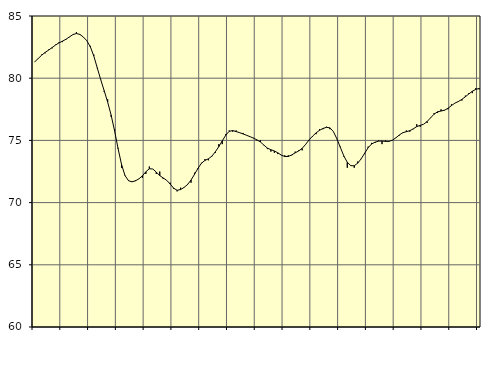
| Category | Piggar | Series 1 |
|---|---|---|
| nan | 81.3 | 81.32 |
| 87.0 | 81.6 | 81.58 |
| 87.0 | 81.9 | 81.85 |
| 87.0 | 82 | 82.07 |
| nan | 82.3 | 82.26 |
| 88.0 | 82.4 | 82.46 |
| 88.0 | 82.7 | 82.67 |
| 88.0 | 82.9 | 82.84 |
| nan | 82.9 | 82.98 |
| 89.0 | 83.1 | 83.13 |
| 89.0 | 83.3 | 83.32 |
| 89.0 | 83.5 | 83.51 |
| nan | 83.7 | 83.59 |
| 90.0 | 83.5 | 83.52 |
| 90.0 | 83.3 | 83.31 |
| 90.0 | 83 | 83.01 |
| nan | 82.6 | 82.53 |
| 91.0 | 81.9 | 81.79 |
| 91.0 | 80.8 | 80.84 |
| 91.0 | 79.9 | 79.88 |
| nan | 78.9 | 78.99 |
| 92.0 | 78.3 | 78.08 |
| 92.0 | 76.9 | 77.03 |
| 92.0 | 75.9 | 75.76 |
| nan | 74.4 | 74.34 |
| 93.0 | 72.8 | 73.06 |
| 93.0 | 72.2 | 72.17 |
| 93.0 | 71.8 | 71.76 |
| nan | 71.7 | 71.67 |
| 94.0 | 71.8 | 71.75 |
| 94.0 | 71.9 | 71.91 |
| 94.0 | 72 | 72.15 |
| nan | 72.3 | 72.48 |
| 95.0 | 72.9 | 72.72 |
| 95.0 | 72.7 | 72.7 |
| 95.0 | 72.3 | 72.45 |
| nan | 72.5 | 72.17 |
| 96.0 | 71.9 | 71.98 |
| 96.0 | 71.8 | 71.79 |
| 96.0 | 71.6 | 71.49 |
| nan | 71.1 | 71.16 |
| 97.0 | 70.9 | 70.99 |
| 97.0 | 71.2 | 71.05 |
| 97.0 | 71.2 | 71.22 |
| nan | 71.5 | 71.45 |
| 98.0 | 71.6 | 71.81 |
| 98.0 | 72.4 | 72.27 |
| 98.0 | 72.7 | 72.75 |
| nan | 73.2 | 73.16 |
| 99.0 | 73.5 | 73.39 |
| 99.0 | 73.4 | 73.52 |
| 99.0 | 73.7 | 73.73 |
| nan | 74 | 74.08 |
| 0.0 | 74.7 | 74.5 |
| 0.0 | 74.7 | 74.96 |
| 0.0 | 75.5 | 75.42 |
| nan | 75.8 | 75.73 |
| 1.0 | 75.7 | 75.79 |
| 1.0 | 75.8 | 75.71 |
| 1.0 | 75.6 | 75.62 |
| nan | 75.6 | 75.52 |
| 2.0 | 75.4 | 75.41 |
| 2.0 | 75.3 | 75.3 |
| 2.0 | 75.2 | 75.18 |
| nan | 75 | 75.04 |
| 3.0 | 75 | 74.87 |
| 3.0 | 74.6 | 74.62 |
| 3.0 | 74.3 | 74.38 |
| nan | 74.1 | 74.25 |
| 4.0 | 74 | 74.15 |
| 4.0 | 73.9 | 74 |
| 4.0 | 73.8 | 73.82 |
| nan | 73.8 | 73.7 |
| 5.0 | 73.8 | 73.71 |
| 5.0 | 73.8 | 73.83 |
| 5.0 | 74.1 | 74 |
| nan | 74.2 | 74.15 |
| 6.0 | 74.2 | 74.36 |
| 6.0 | 74.7 | 74.68 |
| 6.0 | 75 | 75.04 |
| nan | 75.3 | 75.34 |
| 7.0 | 75.5 | 75.6 |
| 7.0 | 75.9 | 75.81 |
| 7.0 | 75.9 | 75.96 |
| nan | 76.1 | 76.05 |
| 8.0 | 75.9 | 76.01 |
| 8.0 | 75.7 | 75.71 |
| 8.0 | 75.1 | 75.13 |
| nan | 74.5 | 74.44 |
| 9.0 | 73.7 | 73.75 |
| 9.0 | 72.8 | 73.24 |
| 9.0 | 73 | 72.97 |
| nan | 72.8 | 72.96 |
| 10.0 | 73.3 | 73.17 |
| 10.0 | 73.5 | 73.52 |
| 10.0 | 73.9 | 73.97 |
| nan | 74.5 | 74.41 |
| 11.0 | 74.8 | 74.71 |
| 11.0 | 74.8 | 74.86 |
| 11.0 | 75 | 74.94 |
| nan | 74.7 | 74.95 |
| 12.0 | 75 | 74.92 |
| 12.0 | 74.9 | 74.92 |
| 12.0 | 75 | 75.02 |
| nan | 75.2 | 75.21 |
| 13.0 | 75.4 | 75.44 |
| 13.0 | 75.6 | 75.62 |
| 13.0 | 75.8 | 75.7 |
| nan | 75.7 | 75.78 |
| 14.0 | 75.9 | 75.93 |
| 14.0 | 76.3 | 76.11 |
| 14.0 | 76.1 | 76.21 |
| nan | 76.3 | 76.3 |
| 15.0 | 76.4 | 76.52 |
| 15.0 | 76.8 | 76.82 |
| 15.0 | 77.2 | 77.11 |
| nan | 77.2 | 77.3 |
| 16.0 | 77.5 | 77.36 |
| 16.0 | 77.4 | 77.43 |
| 16.0 | 77.5 | 77.58 |
| nan | 77.9 | 77.8 |
| 17.0 | 78 | 78 |
| 17.0 | 78.1 | 78.13 |
| 17.0 | 78.2 | 78.3 |
| nan | 78.6 | 78.51 |
| 18.0 | 78.8 | 78.73 |
| 18.0 | 78.8 | 78.95 |
| 18.0 | 79.2 | 79.1 |
| nan | 79.1 | 79.18 |